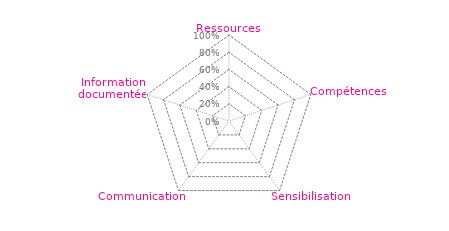
| Category | Art 7 |
|---|---|
| 0 | 0 |
| 1 | 0 |
| 2 | 0 |
| 3 | 0 |
| 4 | 0 |